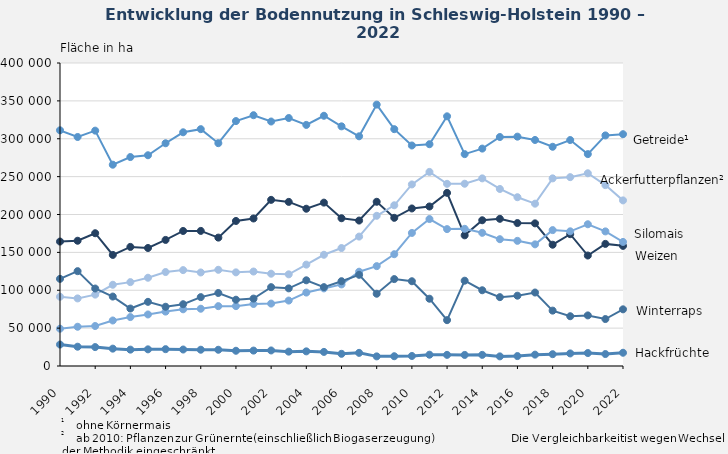
| Category | Getreide¹ | Weizen | Ackerfutterpflanzen² | Silomais | Winterraps | Hackfrüchte |
|---|---|---|---|---|---|---|
| 1990.0 | 311125 | 164285 | 91453 | 49276 | 115052 | 28341 |
| 1991.0 | 302327 | 165342 | 89224 | 51797 | 125200 | 25457 |
| 1992.0 | 310702 | 175267 | 94233 | 52792 | 102279 | 24977 |
| 1993.0 | 265745 | 146637 | 107232 | 60080 | 91673 | 22909 |
| 1994.0 | 275861 | 157210 | 110722 | 64618 | 75856 | 21603 |
| 1995.0 | 278206 | 155795 | 116532 | 68025 | 84698 | 21983 |
| 1996.0 | 294051 | 166428 | 124043 | 71829 | 78202 | 22231 |
| 1997.0 | 308528 | 178251 | 126580 | 74854 | 81564 | 21756 |
| 1998.0 | 312662 | 178334 | 123483 | 75604 | 90930 | 21488 |
| 1999.0 | 294161 | 169488 | 127006 | 79026 | 96378 | 21424 |
| 2000.0 | 323330 | 191461 | 123610 | 79032 | 87513 | 20127 |
| 2001.0 | 331096 | 194756 | 124700 | 81867 | 88978 | 20343 |
| 2002.0 | 322748 | 219333 | 121851 | 82399 | 104072 | 20517 |
| 2003.0 | 327381 | 216638 | 121012 | 86392 | 102495 | 18949 |
| 2004.0 | 318264 | 207605 | 133819 | 96954 | 113143 | 19337 |
| 2005.0 | 330363 | 215677 | 146840 | 102408 | 104109 | 18609 |
| 2006.0 | 316383 | 195077 | 155734 | 107717 | 111956 | 16062 |
| 2007.0 | 303230 | 192013 | 170853 | 124485 | 120386 | 17352 |
| 2008.0 | 345046 | 216782 | 198282 | 131833 | 95397 | 12712 |
| 2009.0 | 312656 | 195627 | 212173 | 147569 | 114733 | 12898 |
| 2010.0 | 291105 | 207956 | 239668 | 175669 | 111890 | 13222 |
| 2011.0 | 292800 | 210600 | 256200 | 194000 | 88800 | 14900 |
| 2012.0 | 329600 | 228600 | 240500 | 180700 | 60500 | 14700 |
| 2013.0 | 279700 | 172500 | 240600 | 181100 | 112600 | 14600 |
| 2014.0 | 287000 | 192400 | 247700 | 175800 | 100000 | 14700 |
| 2015.0 | 302300 | 194300 | 233700 | 167400 | 90900 | 12700 |
| 2016.0 | 302770 | 188694 | 222823 | 165217 | 92817 | 13115 |
| 2017.0 | 298400 | 188300 | 214300 | 160600 | 97000 | 15000 |
| 2018.0 | 289400 | 160100 | 247700 | 179400 | 73100 | 15600 |
| 2019.0 | 298300 | 174000 | 249300 | 177800 | 65700 | 16600 |
| 2020.0 | 279720 | 145849 | 254420 | 187112 | 66791 | 17103 |
| 2021.0 | 304400 | 161200 | 238800 | 177700 | 62000 | 15800 |
| 2022.0 | 306000 | 158600 | 218600 | 163800 | 74800 | 17500 |